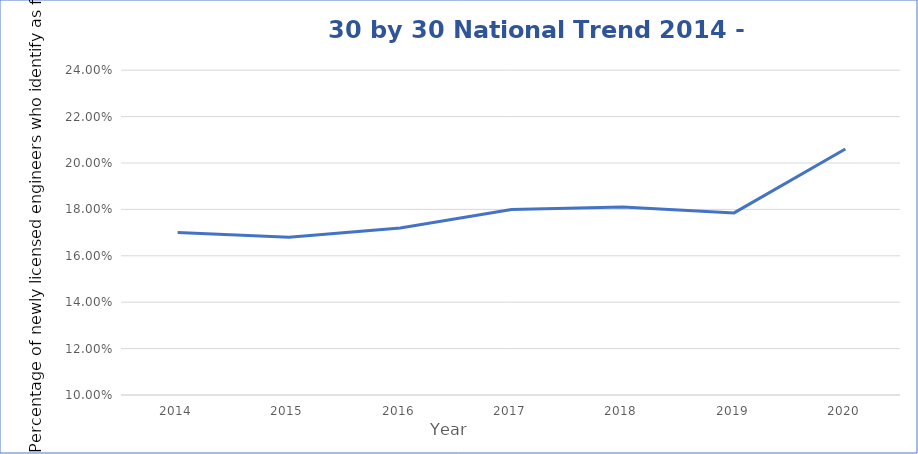
| Category |   National 30 by 30 Percentage   |
|---|---|
| 2014.0 | 0.17 |
| 2015.0 | 0.168 |
| 2016.0 | 0.172 |
| 2017.0 | 0.18 |
| 2018.0 | 0.181 |
| 2019.0 | 0.178 |
| 2020.0 | 0.206 |